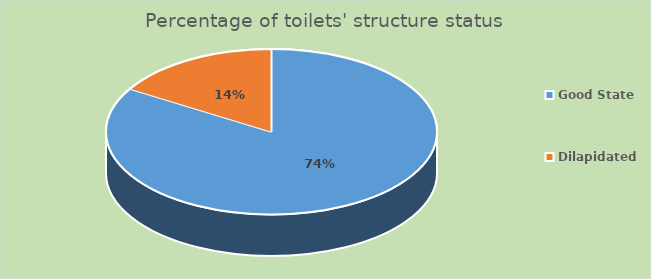
| Category | Series 0 |
|---|---|
| Good State | 0.739 |
| Dilapidated | 0.144 |